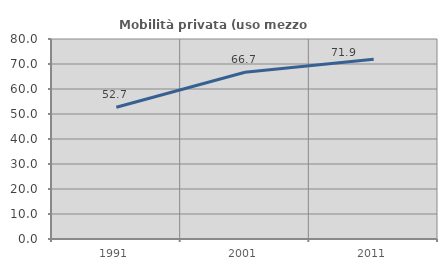
| Category | Mobilità privata (uso mezzo privato) |
|---|---|
| 1991.0 | 52.713 |
| 2001.0 | 66.701 |
| 2011.0 | 71.856 |